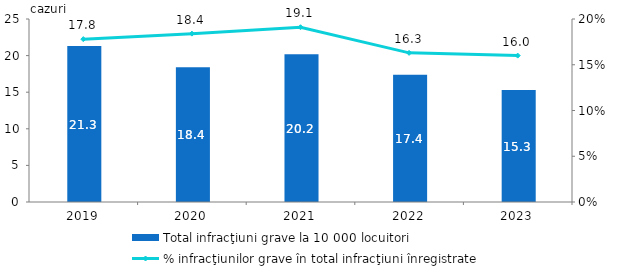
| Category | Total infracţiuni grave la 10 000 locuitori  |
|---|---|
| 2019.0 | 21.3 |
| 2020.0 | 18.4 |
| 2021.0 | 20.2 |
| 2022.0 | 17.4 |
| 2023.0 | 15.3 |